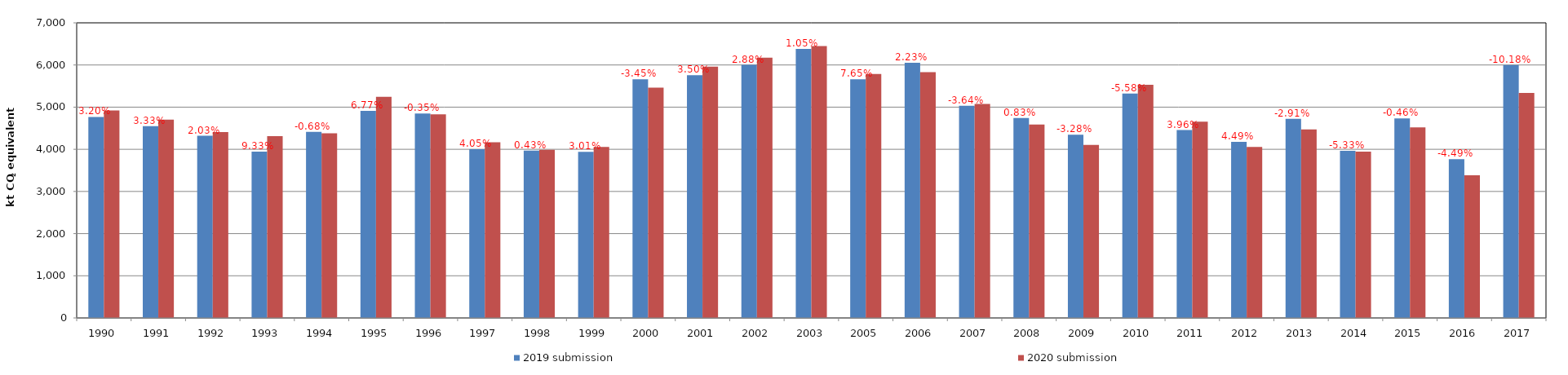
| Category | 2019 submission | 2020 submission |
|---|---|---|
| 1990.0 | 4767.978 | 4920.644 |
| 1991.0 | 4550.885 | 4702.585 |
| 1992.0 | 4319.479 | 4407.252 |
| 1993.0 | 3943.668 | 4311.776 |
| 1994.0 | 4412.027 | 4382.184 |
| 1995.0 | 4914.008 | 5246.542 |
| 1996.0 | 4848.448 | 4831.427 |
| 1997.0 | 4003.735 | 4165.952 |
| 1998.0 | 3969.057 | 3986.023 |
| 1999.0 | 3939.557 | 4057.967 |
| 2000.0 | 5659.838 | 5464.675 |
| 2001.0 | 5756.876 | 5958.303 |
| 2002.0 | 6002.511 | 6175.168 |
| 2003.0 | 6379.97 | 6447.064 |
| 2005.0 | 5661.544 | 5787.747 |
| 2006.0 | 6052.287 | 5831.894 |
| 2007.0 | 5034.632 | 5076.579 |
| 2008.0 | 4740.572 | 4585.311 |
| 2009.0 | 4347.759 | 4105.336 |
| 2010.0 | 5321.712 | 5532.521 |
| 2011.0 | 4456.035 | 4655.991 |
| 2012.0 | 4176.396 | 4055.056 |
| 2013.0 | 4722.827 | 4471.235 |
| 2014.0 | 3965.038 | 3946.708 |
| 2015.0 | 4733.382 | 4520.628 |
| 2016.0 | 3766.466 | 3382.917 |
| 2017.0 | 5997.266 | 5338.175 |